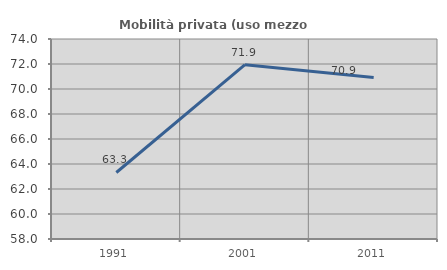
| Category | Mobilità privata (uso mezzo privato) |
|---|---|
| 1991.0 | 63.322 |
| 2001.0 | 71.946 |
| 2011.0 | 70.929 |